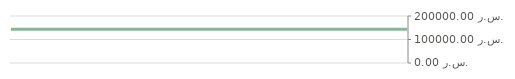
| Category | سنوي  |
|---|---|
| 2013-04-23 | 143800 |
| 2013-04-25 | 143800 |
| 2013-05-07 | 143800 |
| 2013-05-14 | 143800 |
| 2013-05-14 | 143800 |
| 2013-05-29 | 143800 |
| 2013-06-10 | 143800 |
| 2013-06-21 | 143800 |
| 2013-07-06 | 143800 |
| 2013-08-05 | 143800 |
| 2013-08-19 | 143800 |
| 2013-09-04 | 143800 |
| 2013-09-20 | 143800 |
| 2013-09-25 | 143800 |
| 2013-10-15 | 143800 |
| 2013-11-05 | 143800 |
| 2013-11-26 | 143800 |
| 2013-11-30 | 143800 |
| 2013-12-11 | 143800 |